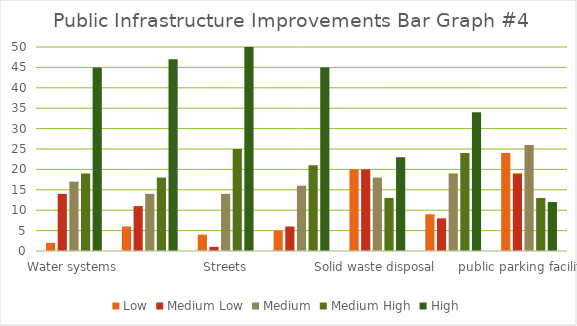
| Category | Low | Medium Low | Medium | Medium High | High |
|---|---|---|---|---|---|
| Water systems | 2 | 14 | 17 | 19 | 45 |
| Sewer systems | 6 | 11 | 14 | 18 | 47 |
| Streets | 4 | 1 | 14 | 25 | 51 |
| Sidewalks | 5 | 6 | 16 | 21 | 45 |
| Solid waste disposal | 20 | 20 | 18 | 13 | 23 |
| surface and storm water drainage | 9 | 8 | 19 | 24 | 34 |
| public parking facilities | 24 | 19 | 26 | 13 | 12 |